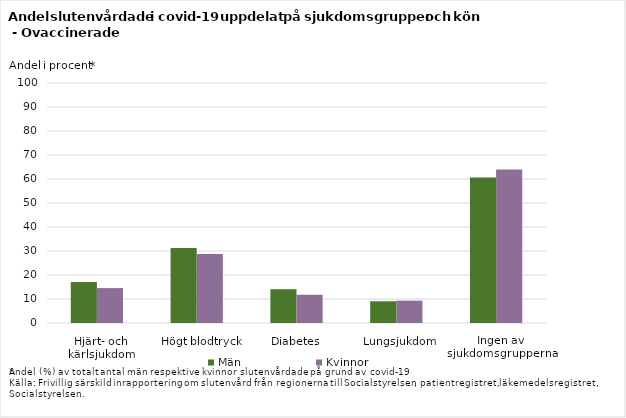
| Category | Män | Kvinnor |
|---|---|---|
| Hjärt- och kärlsjukdom | 17.092 | 14.551 |
| Högt blodtryck | 31.284 | 28.738 |
| Diabetes | 14.076 | 11.769 |
| Lungsjukdom | 9.049 | 9.311 |
| Ingen av sjukdomsgrupperna | 60.596 | 64.006 |